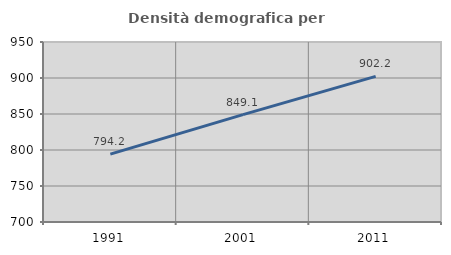
| Category | Densità demografica |
|---|---|
| 1991.0 | 794.205 |
| 2001.0 | 849.098 |
| 2011.0 | 902.176 |